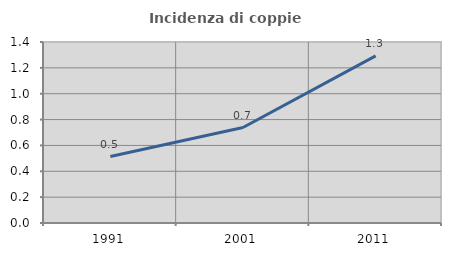
| Category | Incidenza di coppie miste |
|---|---|
| 1991.0 | 0.514 |
| 2001.0 | 0.739 |
| 2011.0 | 1.293 |